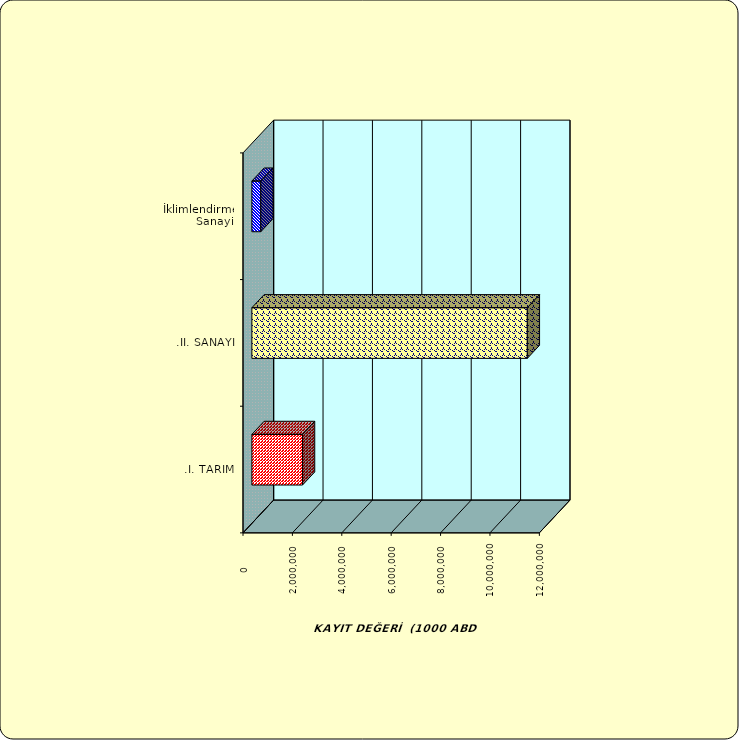
| Category | Series 0 |
|---|---|
| .I. TARIM | 2050283.207 |
| .II. SANAYİ | 11153283.088 |
|  İklimlendirme Sanayii | 361395.47 |